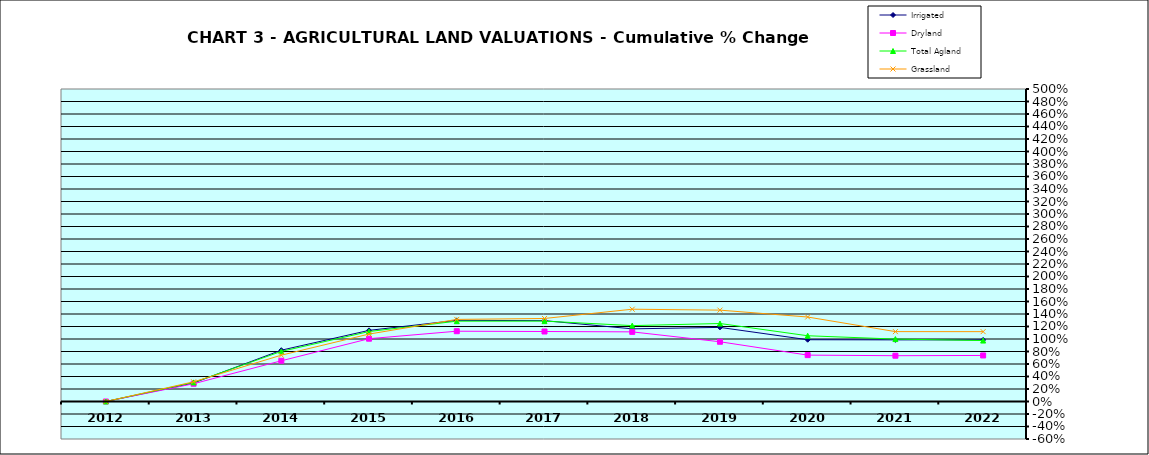
| Category | Irrigated | Dryland | Total Agland | Grassland |
|---|---|---|---|---|
| 2012.0 | 0 | 0 | 0 | 0 |
| 2013.0 | 0.296 | 0.284 | 0.305 | 0.315 |
| 2014.0 | 0.821 | 0.651 | 0.802 | 0.741 |
| 2015.0 | 1.138 | 1.005 | 1.119 | 1.079 |
| 2016.0 | 1.298 | 1.125 | 1.285 | 1.314 |
| 2017.0 | 1.294 | 1.12 | 1.286 | 1.328 |
| 2018.0 | 1.162 | 1.114 | 1.214 | 1.477 |
| 2019.0 | 1.186 | 0.956 | 1.248 | 1.462 |
| 2020.0 | 0.988 | 0.742 | 1.052 | 1.352 |
| 2021.0 | 0.986 | 0.733 | 0.999 | 1.118 |
| 2022.0 | 0.986 | 0.737 | 0.975 | 1.118 |